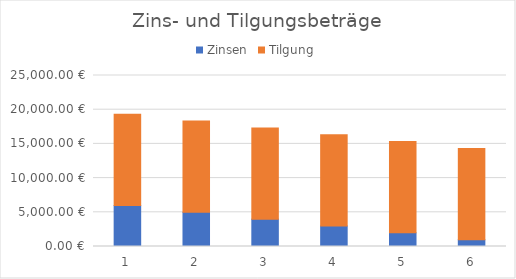
| Category | Zinsen | Tilgung |
|---|---|---|
| 0 | 6000 | 13333.333 |
| 1 | 5000 | 13333.333 |
| 2 | 4000 | 13333.333 |
| 3 | 3000 | 13333.333 |
| 4 | 2000 | 13333.333 |
| 5 | 1000 | 13333.333 |